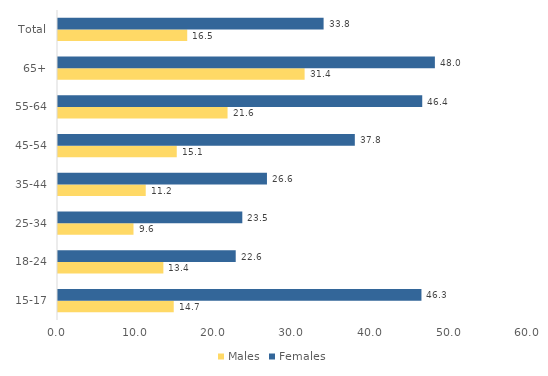
| Category | Males | Females |
|---|---|---|
|  15-17 | 14.744 | 46.3 |
|  18-24 | 13.423 | 22.639 |
|  25-34 | 9.618 | 23.48 |
|  35-44 | 11.177 | 26.619 |
|  45-54 | 15.129 | 37.812 |
|  55-64 | 21.598 | 46.4 |
|  65+ | 31.415 | 48.011 |
| Total | 16.462 | 33.835 |